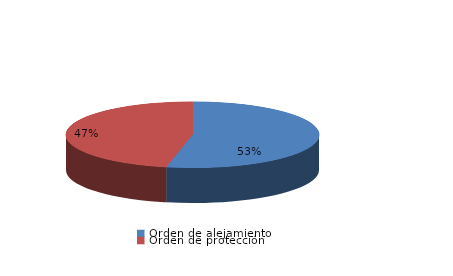
| Category | Series 0 |
|---|---|
| Orden de alejamiento | 65 |
| Orden de protección | 57 |